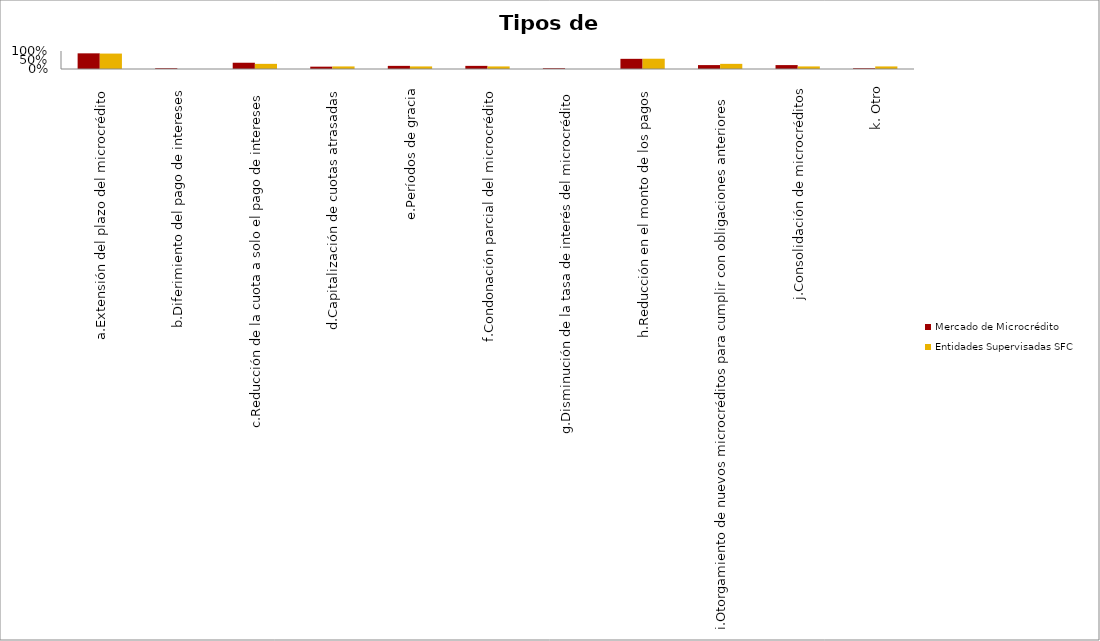
| Category | Mercado de Microcrédito | Entidades Supervisadas SFC |
|---|---|---|
| a.Extensión del plazo del microcrédito | 0.87 | 0.857 |
| b.Diferimiento del pago de intereses | 0.043 | 0 |
| c.Reducción de la cuota a solo el pago de intereses | 0.348 | 0.286 |
| d.Capitalización de cuotas atrasadas | 0.13 | 0.143 |
| e.Períodos de gracia | 0.174 | 0.143 |
| f.Condonación parcial del microcrédito | 0.174 | 0.143 |
| g.Disminución de la tasa de interés del microcrédito | 0.043 | 0 |
| h.Reducción en el monto de los pagos | 0.565 | 0.571 |
| i.Otorgamiento de nuevos microcréditos para cumplir con obligaciones anteriores | 0.217 | 0.286 |
| j.Consolidación de microcréditos | 0.217 | 0.143 |
| k. Otro | 0.043 | 0.143 |